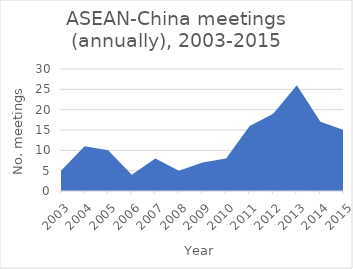
| Category | Number of meetings |
|---|---|
| 2003.0 | 5 |
| 2004.0 | 11 |
| 2005.0 | 10 |
| 2006.0 | 4 |
| 2007.0 | 8 |
| 2008.0 | 5 |
| 2009.0 | 7 |
| 2010.0 | 8 |
| 2011.0 | 16 |
| 2012.0 | 19 |
| 2013.0 | 26 |
| 2014.0 | 17 |
| 2015.0 | 15 |